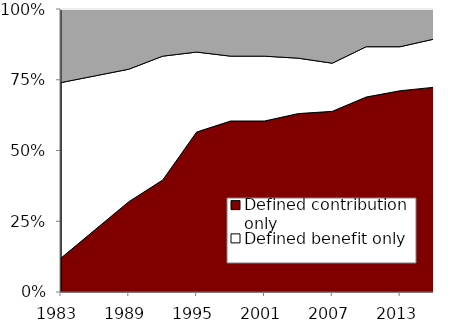
| Category | Defined contribution only | Defined benefit only | Both |
|---|---|---|---|
| 1983.0 | 0.12 | 0.62 | 0.26 |
| 1986.0 | 0.22 | 0.544 | 0.236 |
| 1989.0 | 0.319 | 0.468 | 0.213 |
| 1992.0 | 0.396 | 0.437 | 0.167 |
| 1995.0 | 0.565 | 0.283 | 0.152 |
| 1998.0 | 0.604 | 0.229 | 0.167 |
| 2001.0 | 0.604 | 0.229 | 0.167 |
| 2004.0 | 0.63 | 0.196 | 0.174 |
| 2007.0 | 0.638 | 0.17 | 0.191 |
| 2010.0 | 0.689 | 0.178 | 0.133 |
| 2013.0 | 0.711 | 0.156 | 0.133 |
| 2016.0 | 0.723 | 0.17 | 0.106 |